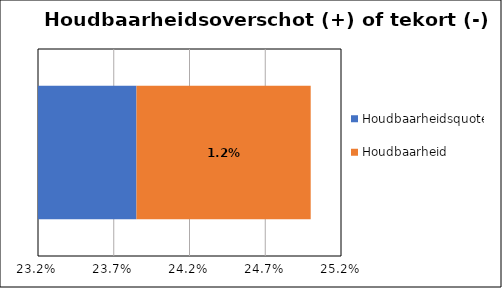
| Category | Houdbaarheidsquote | Houdbaarheid |
|---|---|---|
| Netto schuldquote ultimo 2022 | 0.238 | 0.012 |